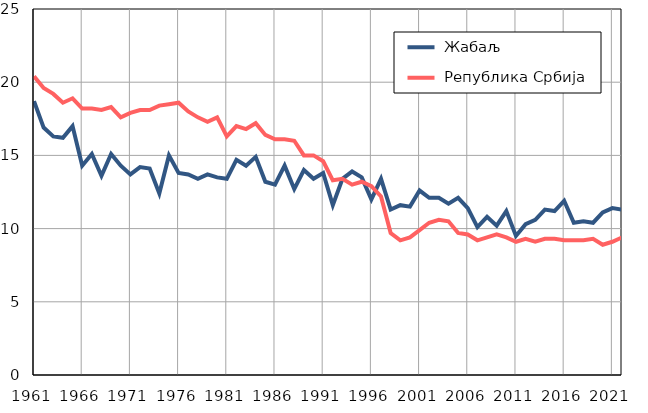
| Category |  Жабаљ |  Република Србија |
|---|---|---|
| 1961.0 | 18.7 | 20.4 |
| 1962.0 | 16.9 | 19.6 |
| 1963.0 | 16.3 | 19.2 |
| 1964.0 | 16.2 | 18.6 |
| 1965.0 | 17 | 18.9 |
| 1966.0 | 14.3 | 18.2 |
| 1967.0 | 15.1 | 18.2 |
| 1968.0 | 13.6 | 18.1 |
| 1969.0 | 15.1 | 18.3 |
| 1970.0 | 14.3 | 17.6 |
| 1971.0 | 13.7 | 17.9 |
| 1972.0 | 14.2 | 18.1 |
| 1973.0 | 14.1 | 18.1 |
| 1974.0 | 12.4 | 18.4 |
| 1975.0 | 15 | 18.5 |
| 1976.0 | 13.8 | 18.6 |
| 1977.0 | 13.7 | 18 |
| 1978.0 | 13.4 | 17.6 |
| 1979.0 | 13.7 | 17.3 |
| 1980.0 | 13.5 | 17.6 |
| 1981.0 | 13.4 | 16.3 |
| 1982.0 | 14.7 | 17 |
| 1983.0 | 14.3 | 16.8 |
| 1984.0 | 14.9 | 17.2 |
| 1985.0 | 13.2 | 16.4 |
| 1986.0 | 13 | 16.1 |
| 1987.0 | 14.3 | 16.1 |
| 1988.0 | 12.7 | 16 |
| 1989.0 | 14 | 15 |
| 1990.0 | 13.4 | 15 |
| 1991.0 | 13.8 | 14.6 |
| 1992.0 | 11.6 | 13.3 |
| 1993.0 | 13.4 | 13.4 |
| 1994.0 | 13.9 | 13 |
| 1995.0 | 13.5 | 13.2 |
| 1996.0 | 12 | 12.9 |
| 1997.0 | 13.4 | 12.2 |
| 1998.0 | 11.3 | 9.7 |
| 1999.0 | 11.6 | 9.2 |
| 2000.0 | 11.5 | 9.4 |
| 2001.0 | 12.6 | 9.9 |
| 2002.0 | 12.1 | 10.4 |
| 2003.0 | 12.1 | 10.6 |
| 2004.0 | 11.7 | 10.5 |
| 2005.0 | 12.1 | 9.7 |
| 2006.0 | 11.4 | 9.6 |
| 2007.0 | 10.1 | 9.2 |
| 2008.0 | 10.8 | 9.4 |
| 2009.0 | 10.2 | 9.6 |
| 2010.0 | 11.2 | 9.4 |
| 2011.0 | 9.5 | 9.1 |
| 2012.0 | 10.3 | 9.3 |
| 2013.0 | 10.6 | 9.1 |
| 2014.0 | 11.3 | 9.3 |
| 2015.0 | 11.2 | 9.3 |
| 2016.0 | 11.9 | 9.2 |
| 2017.0 | 10.4 | 9.2 |
| 2018.0 | 10.5 | 9.2 |
| 2019.0 | 10.4 | 9.3 |
| 2020.0 | 11.1 | 8.9 |
| 2021.0 | 11.4 | 9.1 |
| 2022.0 | 11.3 | 9.4 |